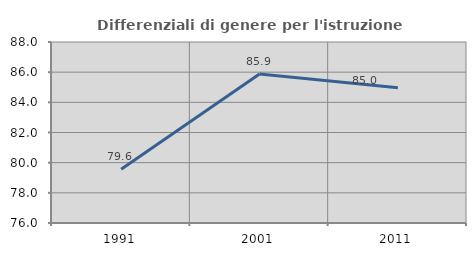
| Category | Differenziali di genere per l'istruzione superiore |
|---|---|
| 1991.0 | 79.562 |
| 2001.0 | 85.877 |
| 2011.0 | 84.967 |